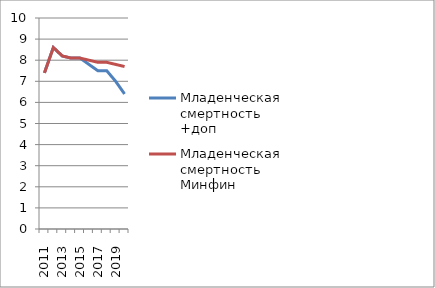
| Category | Младенческая смертность +доп | Младенческая смертность Минфин |
|---|---|---|
| 2011.0 | 7.4 | 7.4 |
| 2012.0 | 8.6 | 8.6 |
| 2013.0 | 8.2 | 8.2 |
| 2014.0 | 8.1 | 8.1 |
| 2015.0 | 8.1 | 8.1 |
| 2016.0 | 7.8 | 8 |
| 2017.0 | 7.5 | 7.9 |
| 2018.0 | 7.5 | 7.9 |
| 2019.0 | 7 | 7.8 |
| 2020.0 | 6.4 | 7.7 |